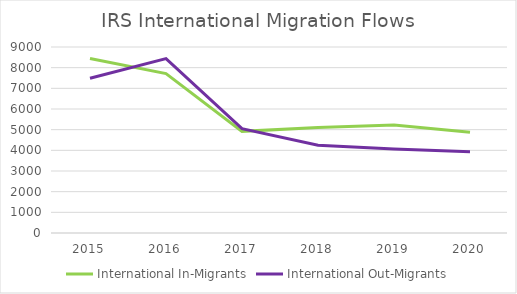
| Category | International In-Migrants | International Out-Migrants |
|---|---|---|
| 2015.0 | 8444 | 7490 |
| 2016.0 | 7712 | 8438 |
| 2017.0 | 4918 | 5052 |
| 2018.0 | 5109 | 4251 |
| 2019.0 | 5223 | 4062 |
| 2020.0 | 4871 | 3930 |